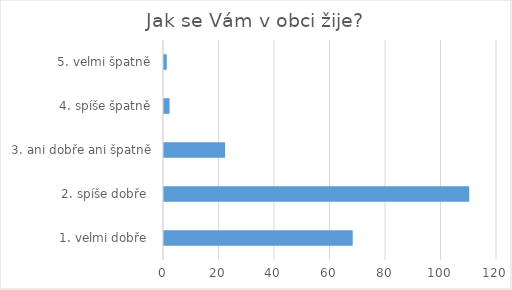
| Category | Series 0 |
|---|---|
| 1. velmi dobře  | 68 |
| 2. spíše dobře  | 110 |
| 3. ani dobře ani špatně | 22 |
| 4. spíše špatně | 2 |
| 5. velmi špatně | 1 |